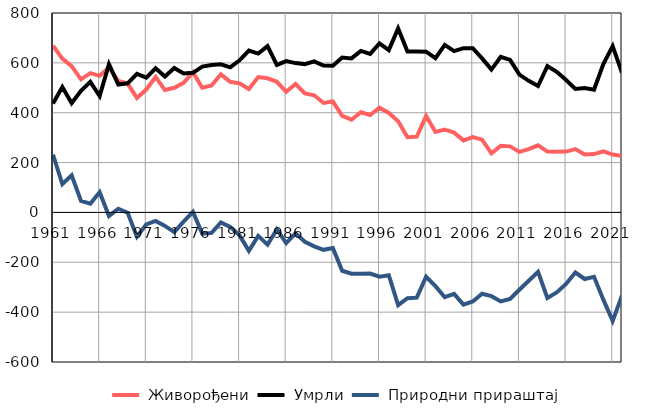
| Category |  Живорођени |  Умрли |  Природни прираштај |
|---|---|---|---|
| 1961.0 | 669 | 437 | 232 |
| 1962.0 | 617 | 503 | 114 |
| 1963.0 | 587 | 438 | 149 |
| 1964.0 | 534 | 488 | 46 |
| 1965.0 | 559 | 524 | 35 |
| 1966.0 | 548 | 467 | 81 |
| 1967.0 | 581 | 595 | -14 |
| 1968.0 | 528 | 513 | 15 |
| 1969.0 | 517 | 518 | -1 |
| 1970.0 | 459 | 556 | -97 |
| 1971.0 | 493 | 541 | -48 |
| 1972.0 | 544 | 578 | -34 |
| 1973.0 | 491 | 545 | -54 |
| 1974.0 | 500 | 579 | -79 |
| 1975.0 | 520 | 557 | -37 |
| 1976.0 | 562 | 560 | 2 |
| 1977.0 | 500 | 585 | -85 |
| 1978.0 | 509 | 591 | -82 |
| 1979.0 | 554 | 594 | -40 |
| 1980.0 | 524 | 582 | -58 |
| 1981.0 | 518 | 610 | -92 |
| 1982.0 | 495 | 649 | -154 |
| 1983.0 | 543 | 637 | -94 |
| 1984.0 | 538 | 667 | -129 |
| 1985.0 | 524 | 592 | -68 |
| 1986.0 | 484 | 607 | -123 |
| 1987.0 | 515 | 599 | -84 |
| 1988.0 | 477 | 595 | -118 |
| 1989.0 | 470 | 606 | -136 |
| 1990.0 | 439 | 589 | -150 |
| 1991.0 | 445 | 588 | -143 |
| 1992.0 | 387 | 621 | -234 |
| 1993.0 | 372 | 618 | -246 |
| 1994.0 | 402 | 648 | -246 |
| 1995.0 | 391 | 636 | -245 |
| 1996.0 | 420 | 678 | -258 |
| 1997.0 | 399 | 651 | -252 |
| 1998.0 | 366 | 738 | -372 |
| 1999.0 | 302 | 646 | -344 |
| 2000.0 | 304 | 646 | -342 |
| 2001.0 | 387 | 645 | -258 |
| 2002.0 | 323 | 619 | -296 |
| 2003.0 | 332 | 672 | -340 |
| 2004.0 | 320 | 647 | -327 |
| 2005.0 | 289 | 659 | -370 |
| 2006.0 | 302 | 659 | -357 |
| 2007.0 | 292 | 618 | -326 |
| 2008.0 | 237 | 573 | -336 |
| 2009.0 | 267 | 624 | -357 |
| 2010.0 | 265 | 612 | -347 |
| 2011.0 | 243 | 553 | -310 |
| 2012.0 | 254 | 528 | -274 |
| 2013.0 | 269 | 507 | -238 |
| 2014.0 | 244 | 587 | -343 |
| 2015.0 | 243 | 564 | -321 |
| 2016.0 | 244 | 531 | -287 |
| 2017.0 | 254 | 495 | -241 |
| 2018.0 | 232 | 499 | -267 |
| 2019.0 | 234 | 492 | -258 |
| 2020.0 | 245 | 595 | -350 |
| 2021.0 | 232 | 667 | -435 |
| 2022.0 | 227 | 560 | -333 |